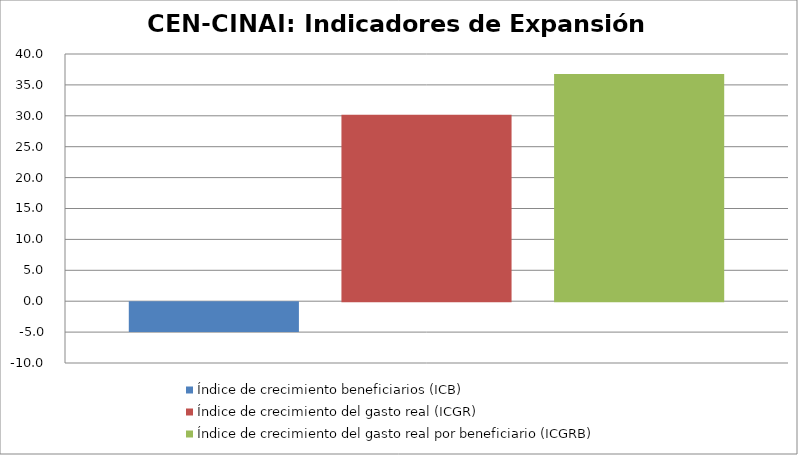
| Category | Índice de crecimiento beneficiarios (ICB)  | Índice de crecimiento del gasto real (ICGR)  | Índice de crecimiento del gasto real por beneficiario (ICGRB)  |
|---|---|---|---|
| Total | -4.818 | 30.183 | 36.773 |